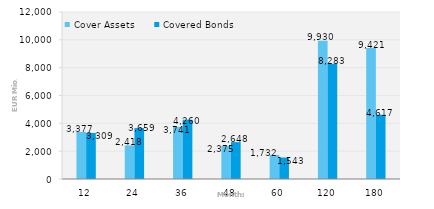
| Category | Cover Assets | Covered Bonds |
|---|---|---|
| 12.0 | 3377 | 3309.4 |
| 24.0 | 2418.4 | 3658.8 |
| 36.0 | 3741 | 4259.9 |
| 48.0 | 2374.7 | 2648.3 |
| 60.0 | 1732.1 | 1542.7 |
| 120.0 | 9929.9 | 8283 |
| 180.0 | 9420.7 | 4616.6 |